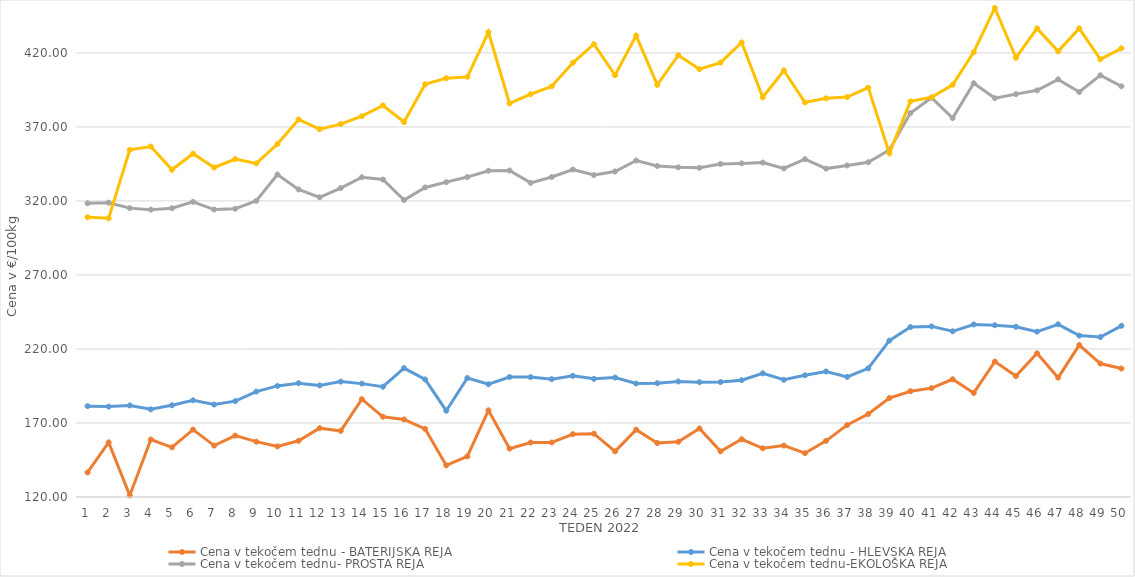
| Category | Cena v tekočem tednu - BATERIJSKA REJA | Cena v tekočem tednu - HLEVSKA REJA | Cena v tekočem tednu- PROSTA REJA | Cena v tekočem tednu-EKOLOŠKA REJA |
|---|---|---|---|---|
| 1.0 | 136.59 | 181.38 | 318.4 | 308.97 |
| 2.0 | 156.88 | 181.07 | 318.82 | 308.28 |
| 3.0 | 121.07 | 181.83 | 315.14 | 354.48 |
| 4.0 | 158.82 | 179.22 | 314.08 | 356.72 |
| 5.0 | 153.55 | 181.96 | 315.1 | 341.03 |
| 6.0 | 165.51 | 185.31 | 319.38 | 351.9 |
| 7.0 | 154.74 | 182.45 | 314.16 | 342.59 |
| 8.0 | 161.48 | 184.77 | 314.71 | 348.28 |
| 9.0 | 157.38 | 191.21 | 320.1 | 345.35 |
| 10.0 | 154.16 | 195.04 | 337.83 | 358.45 |
| 11.0 | 157.96 | 196.88 | 327.79 | 375 |
| 12.0 | 166.49 | 195.36 | 322.46 | 368.45 |
| 13.0 | 164.66 | 197.95 | 328.67 | 371.9 |
| 14.0 | 186.11 | 196.59 | 336.02 | 377.24 |
| 15.0 | 174.18 | 194.49 | 334.46 | 384.48 |
| 16.0 | 172.42 | 207.1 | 320.58 | 373.28 |
| 17.0 | 165.96 | 199.41 | 329.11 | 398.79 |
| 18.0 | 141.36 | 178.29 | 332.71 | 402.93 |
| 19.0 | 147.43 | 200.37 | 336.11 | 403.79 |
| 20.0 | 178.51 | 196.16 | 340.4 | 433.97 |
| 21.0 | 152.67 | 201.05 | 340.55 | 385.86 |
| 22.0 | 156.8 | 200.98 | 332.23 | 392.07 |
| 23.0 | 156.84 | 199.63 | 336.16 | 397.41 |
| 24.0 | 162.44 | 201.86 | 341.24 | 413.28 |
| 25.0 | 162.78 | 199.81 | 337.48 | 425.86 |
| 26.0 | 150.82 | 200.65 | 339.9 | 405 |
| 27.0 | 165.45 | 196.64 | 347.3 | 431.72 |
| 28.0 | 156.46 | 196.88 | 343.56 | 398.45 |
| 29.0 | 157.31 | 198.03 | 342.71 | 418.45 |
| 30.0 | 166.29 | 197.55 | 342.35 | 408.97 |
| 31.0 | 150.81 | 197.66 | 344.97 | 413.45 |
| 32.0 | 158.99 | 198.9 | 345.35 | 427.07 |
| 33.0 | 152.91 | 203.57 | 345.9 | 390 |
| 34.0 | 154.73 | 199.17 | 341.92 | 408.1 |
| 35.0 | 149.6 | 202.21 | 348.2 | 386.55 |
| 36.0 | 157.93 | 204.81 | 341.85 | 389.31 |
| 37.0 | 168.61 | 201.11 | 343.97 | 390.17 |
| 38.0 | 176.07 | 206.91 | 346.16 | 396.55 |
| 39.0 | 186.86 | 225.6 | 354.41 | 352.24 |
| 40.0 | 191.45 | 234.79 | 379.35 | 387.24 |
| 41.0 | 193.52 | 235.24 | 389.75 | 390 |
| 42.0 | 199.51 | 231.92 | 376.02 | 398.45 |
| 43.0 | 190.28 | 236.56 | 399.51 | 420.52 |
| 44.0 | 211.53 | 236.04 | 389.44 | 450.35 |
| 45.0 | 201.69 | 235.01 | 392.15 | 416.72 |
| 46.0 | 217.08 | 231.68 | 394.71 | 436.55 |
| 47.0 | 200.62 | 236.65 | 402.12 | 421.03 |
| 48.0 | 222.61 | 229.05 | 393.56 | 436.55 |
| 49.0 | 210.16 | 228.03 | 404.87 | 415.69 |
| 50.0 | 206.76 | 235.63 | 397.4 | 423.1 |